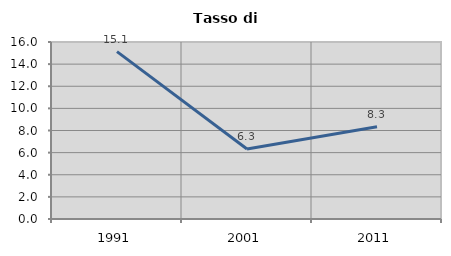
| Category | Tasso di disoccupazione   |
|---|---|
| 1991.0 | 15.128 |
| 2001.0 | 6.326 |
| 2011.0 | 8.33 |